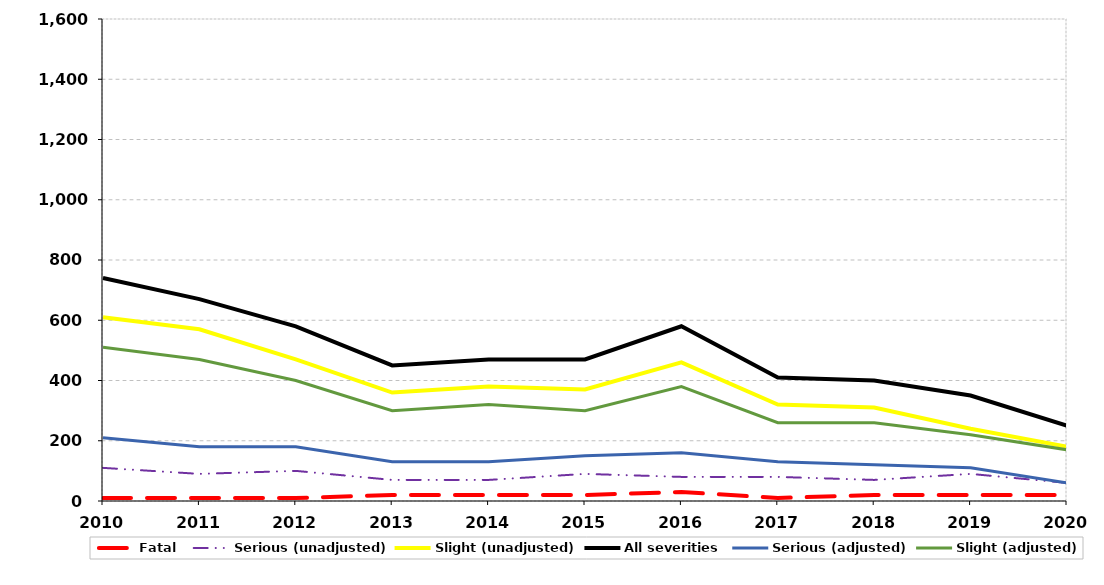
| Category | Fatal | Serious (unadjusted) | Slight (unadjusted) | All severities | Serious (adjusted) | Slight (adjusted) |
|---|---|---|---|---|---|---|
| 2010.0 | 10 | 110 | 610 | 740 | 210 | 510 |
| 2011.0 | 10 | 90 | 570 | 670 | 180 | 470 |
| 2012.0 | 10 | 100 | 470 | 580 | 180 | 400 |
| 2013.0 | 20 | 70 | 360 | 450 | 130 | 300 |
| 2014.0 | 20 | 70 | 380 | 470 | 130 | 320 |
| 2015.0 | 20 | 90 | 370 | 470 | 150 | 300 |
| 2016.0 | 30 | 80 | 460 | 580 | 160 | 380 |
| 2017.0 | 10 | 80 | 320 | 410 | 130 | 260 |
| 2018.0 | 20 | 70 | 310 | 400 | 120 | 260 |
| 2019.0 | 20 | 90 | 240 | 350 | 110 | 220 |
| 2020.0 | 20 | 60 | 180 | 250 | 60 | 170 |